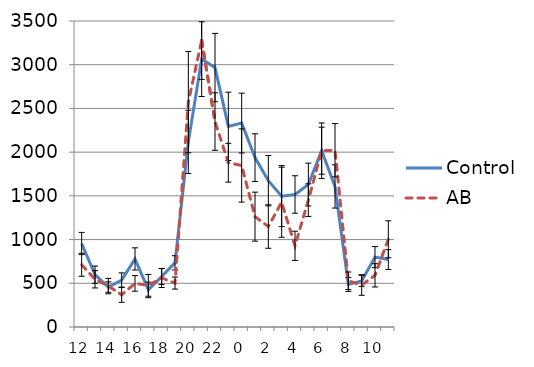
| Category | Control | AB |
|---|---|---|
| 12.0 | 955.014 | 712.033 |
| 13.0 | 598.828 | 545.55 |
| 14.0 | 456.803 | 467.994 |
| 15.0 | 537.197 | 367.811 |
| 16.0 | 778.476 | 498.756 |
| 17.0 | 424.421 | 476.578 |
| 18.0 | 577.162 | 560.772 |
| 19.0 | 733.793 | 502.533 |
| 20.0 | 2117.738 | 2572.456 |
| 21.0 | 3063.741 | 3278.261 |
| 22.0 | 2967.466 | 2349.933 |
| 23.0 | 2294.862 | 1879.128 |
| 0.0 | 2332.783 | 1847.3 |
| 1.0 | 1937.407 | 1262.122 |
| 2.0 | 1673.29 | 1149.039 |
| 3.0 | 1496.924 | 1427.111 |
| 4.0 | 1515.659 | 928.478 |
| 5.0 | 1629.686 | 1451.211 |
| 6.0 | 2016.49 | 2015.783 |
| 7.0 | 1607.521 | 2021.533 |
| 8.0 | 486.669 | 528.883 |
| 9.0 | 527.624 | 480.139 |
| 10.0 | 799.152 | 590.933 |
| 11.0 | 771.531 | 1003.556 |